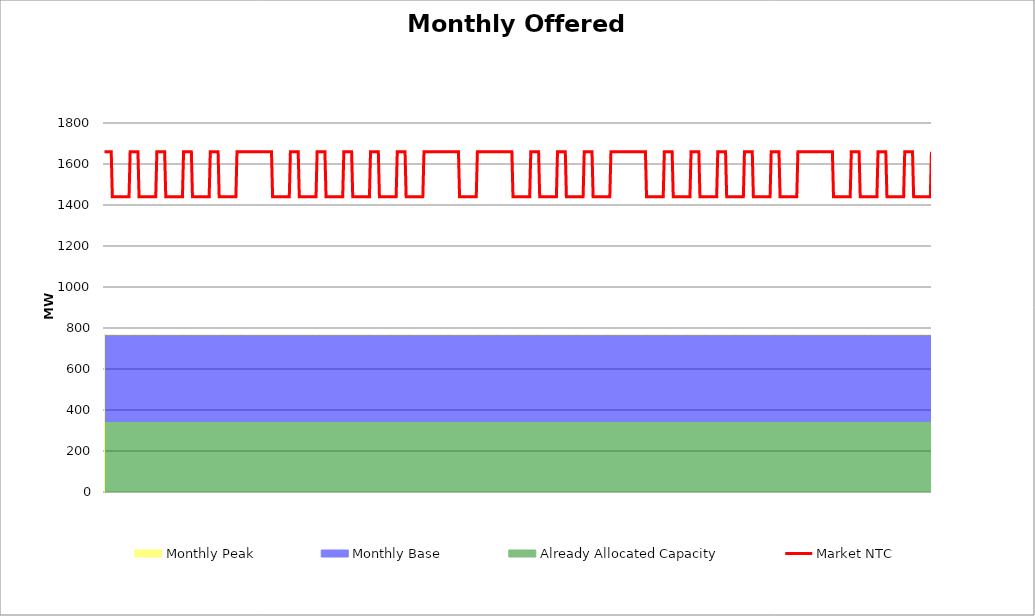
| Category | Market NTC |
|---|---|
| 0 | 1660 |
| 1 | 1660 |
| 2 | 1660 |
| 3 | 1660 |
| 4 | 1660 |
| 5 | 1660 |
| 6 | 1660 |
| 7 | 1440 |
| 8 | 1440 |
| 9 | 1440 |
| 10 | 1440 |
| 11 | 1440 |
| 12 | 1440 |
| 13 | 1440 |
| 14 | 1440 |
| 15 | 1440 |
| 16 | 1440 |
| 17 | 1440 |
| 18 | 1440 |
| 19 | 1440 |
| 20 | 1440 |
| 21 | 1440 |
| 22 | 1440 |
| 23 | 1660 |
| 24 | 1660 |
| 25 | 1660 |
| 26 | 1660 |
| 27 | 1660 |
| 28 | 1660 |
| 29 | 1660 |
| 30 | 1660 |
| 31 | 1440 |
| 32 | 1440 |
| 33 | 1440 |
| 34 | 1440 |
| 35 | 1440 |
| 36 | 1440 |
| 37 | 1440 |
| 38 | 1440 |
| 39 | 1440 |
| 40 | 1440 |
| 41 | 1440 |
| 42 | 1440 |
| 43 | 1440 |
| 44 | 1440 |
| 45 | 1440 |
| 46 | 1440 |
| 47 | 1660 |
| 48 | 1660 |
| 49 | 1660 |
| 50 | 1660 |
| 51 | 1660 |
| 52 | 1660 |
| 53 | 1660 |
| 54 | 1660 |
| 55 | 1440 |
| 56 | 1440 |
| 57 | 1440 |
| 58 | 1440 |
| 59 | 1440 |
| 60 | 1440 |
| 61 | 1440 |
| 62 | 1440 |
| 63 | 1440 |
| 64 | 1440 |
| 65 | 1440 |
| 66 | 1440 |
| 67 | 1440 |
| 68 | 1440 |
| 69 | 1440 |
| 70 | 1440 |
| 71 | 1660 |
| 72 | 1660 |
| 73 | 1660 |
| 74 | 1660 |
| 75 | 1660 |
| 76 | 1660 |
| 77 | 1660 |
| 78 | 1660 |
| 79 | 1440 |
| 80 | 1440 |
| 81 | 1440 |
| 82 | 1440 |
| 83 | 1440 |
| 84 | 1440 |
| 85 | 1440 |
| 86 | 1440 |
| 87 | 1440 |
| 88 | 1440 |
| 89 | 1440 |
| 90 | 1440 |
| 91 | 1440 |
| 92 | 1440 |
| 93 | 1440 |
| 94 | 1440 |
| 95 | 1660 |
| 96 | 1660 |
| 97 | 1660 |
| 98 | 1660 |
| 99 | 1660 |
| 100 | 1660 |
| 101 | 1660 |
| 102 | 1660 |
| 103 | 1440 |
| 104 | 1440 |
| 105 | 1440 |
| 106 | 1440 |
| 107 | 1440 |
| 108 | 1440 |
| 109 | 1440 |
| 110 | 1440 |
| 111 | 1440 |
| 112 | 1440 |
| 113 | 1440 |
| 114 | 1440 |
| 115 | 1440 |
| 116 | 1440 |
| 117 | 1440 |
| 118 | 1440 |
| 119 | 1660 |
| 120 | 1660 |
| 121 | 1660 |
| 122 | 1660 |
| 123 | 1660 |
| 124 | 1660 |
| 125 | 1660 |
| 126 | 1660 |
| 127 | 1660 |
| 128 | 1660 |
| 129 | 1660 |
| 130 | 1660 |
| 131 | 1660 |
| 132 | 1660 |
| 133 | 1660 |
| 134 | 1660 |
| 135 | 1660 |
| 136 | 1660 |
| 137 | 1660 |
| 138 | 1660 |
| 139 | 1660 |
| 140 | 1660 |
| 141 | 1660 |
| 142 | 1660 |
| 143 | 1660 |
| 144 | 1660 |
| 145 | 1660 |
| 146 | 1660 |
| 147 | 1660 |
| 148 | 1660 |
| 149 | 1660 |
| 150 | 1660 |
| 151 | 1440 |
| 152 | 1440 |
| 153 | 1440 |
| 154 | 1440 |
| 155 | 1440 |
| 156 | 1440 |
| 157 | 1440 |
| 158 | 1440 |
| 159 | 1440 |
| 160 | 1440 |
| 161 | 1440 |
| 162 | 1440 |
| 163 | 1440 |
| 164 | 1440 |
| 165 | 1440 |
| 166 | 1440 |
| 167 | 1660 |
| 168 | 1660 |
| 169 | 1660 |
| 170 | 1660 |
| 171 | 1660 |
| 172 | 1660 |
| 173 | 1660 |
| 174 | 1660 |
| 175 | 1440 |
| 176 | 1440 |
| 177 | 1440 |
| 178 | 1440 |
| 179 | 1440 |
| 180 | 1440 |
| 181 | 1440 |
| 182 | 1440 |
| 183 | 1440 |
| 184 | 1440 |
| 185 | 1440 |
| 186 | 1440 |
| 187 | 1440 |
| 188 | 1440 |
| 189 | 1440 |
| 190 | 1440 |
| 191 | 1660 |
| 192 | 1660 |
| 193 | 1660 |
| 194 | 1660 |
| 195 | 1660 |
| 196 | 1660 |
| 197 | 1660 |
| 198 | 1660 |
| 199 | 1440 |
| 200 | 1440 |
| 201 | 1440 |
| 202 | 1440 |
| 203 | 1440 |
| 204 | 1440 |
| 205 | 1440 |
| 206 | 1440 |
| 207 | 1440 |
| 208 | 1440 |
| 209 | 1440 |
| 210 | 1440 |
| 211 | 1440 |
| 212 | 1440 |
| 213 | 1440 |
| 214 | 1440 |
| 215 | 1660 |
| 216 | 1660 |
| 217 | 1660 |
| 218 | 1660 |
| 219 | 1660 |
| 220 | 1660 |
| 221 | 1660 |
| 222 | 1660 |
| 223 | 1440 |
| 224 | 1440 |
| 225 | 1440 |
| 226 | 1440 |
| 227 | 1440 |
| 228 | 1440 |
| 229 | 1440 |
| 230 | 1440 |
| 231 | 1440 |
| 232 | 1440 |
| 233 | 1440 |
| 234 | 1440 |
| 235 | 1440 |
| 236 | 1440 |
| 237 | 1440 |
| 238 | 1440 |
| 239 | 1660 |
| 240 | 1660 |
| 241 | 1660 |
| 242 | 1660 |
| 243 | 1660 |
| 244 | 1660 |
| 245 | 1660 |
| 246 | 1660 |
| 247 | 1440 |
| 248 | 1440 |
| 249 | 1440 |
| 250 | 1440 |
| 251 | 1440 |
| 252 | 1440 |
| 253 | 1440 |
| 254 | 1440 |
| 255 | 1440 |
| 256 | 1440 |
| 257 | 1440 |
| 258 | 1440 |
| 259 | 1440 |
| 260 | 1440 |
| 261 | 1440 |
| 262 | 1440 |
| 263 | 1660 |
| 264 | 1660 |
| 265 | 1660 |
| 266 | 1660 |
| 267 | 1660 |
| 268 | 1660 |
| 269 | 1660 |
| 270 | 1660 |
| 271 | 1440 |
| 272 | 1440 |
| 273 | 1440 |
| 274 | 1440 |
| 275 | 1440 |
| 276 | 1440 |
| 277 | 1440 |
| 278 | 1440 |
| 279 | 1440 |
| 280 | 1440 |
| 281 | 1440 |
| 282 | 1440 |
| 283 | 1440 |
| 284 | 1440 |
| 285 | 1440 |
| 286 | 1440 |
| 287 | 1660 |
| 288 | 1660 |
| 289 | 1660 |
| 290 | 1660 |
| 291 | 1660 |
| 292 | 1660 |
| 293 | 1660 |
| 294 | 1660 |
| 295 | 1660 |
| 296 | 1660 |
| 297 | 1660 |
| 298 | 1660 |
| 299 | 1660 |
| 300 | 1660 |
| 301 | 1660 |
| 302 | 1660 |
| 303 | 1660 |
| 304 | 1660 |
| 305 | 1660 |
| 306 | 1660 |
| 307 | 1660 |
| 308 | 1660 |
| 309 | 1660 |
| 310 | 1660 |
| 311 | 1660 |
| 312 | 1660 |
| 313 | 1660 |
| 314 | 1660 |
| 315 | 1660 |
| 316 | 1660 |
| 317 | 1660 |
| 318 | 1660 |
| 319 | 1440 |
| 320 | 1440 |
| 321 | 1440 |
| 322 | 1440 |
| 323 | 1440 |
| 324 | 1440 |
| 325 | 1440 |
| 326 | 1440 |
| 327 | 1440 |
| 328 | 1440 |
| 329 | 1440 |
| 330 | 1440 |
| 331 | 1440 |
| 332 | 1440 |
| 333 | 1440 |
| 334 | 1440 |
| 335 | 1660 |
| 336 | 1660 |
| 337 | 1660 |
| 338 | 1660 |
| 339 | 1660 |
| 340 | 1660 |
| 341 | 1660 |
| 342 | 1660 |
| 343 | 1660 |
| 344 | 1660 |
| 345 | 1660 |
| 346 | 1660 |
| 347 | 1660 |
| 348 | 1660 |
| 349 | 1660 |
| 350 | 1660 |
| 351 | 1660 |
| 352 | 1660 |
| 353 | 1660 |
| 354 | 1660 |
| 355 | 1660 |
| 356 | 1660 |
| 357 | 1660 |
| 358 | 1660 |
| 359 | 1660 |
| 360 | 1660 |
| 361 | 1660 |
| 362 | 1660 |
| 363 | 1660 |
| 364 | 1660 |
| 365 | 1660 |
| 366 | 1660 |
| 367 | 1440 |
| 368 | 1440 |
| 369 | 1440 |
| 370 | 1440 |
| 371 | 1440 |
| 372 | 1440 |
| 373 | 1440 |
| 374 | 1440 |
| 375 | 1440 |
| 376 | 1440 |
| 377 | 1440 |
| 378 | 1440 |
| 379 | 1440 |
| 380 | 1440 |
| 381 | 1440 |
| 382 | 1440 |
| 383 | 1660 |
| 384 | 1660 |
| 385 | 1660 |
| 386 | 1660 |
| 387 | 1660 |
| 388 | 1660 |
| 389 | 1660 |
| 390 | 1660 |
| 391 | 1440 |
| 392 | 1440 |
| 393 | 1440 |
| 394 | 1440 |
| 395 | 1440 |
| 396 | 1440 |
| 397 | 1440 |
| 398 | 1440 |
| 399 | 1440 |
| 400 | 1440 |
| 401 | 1440 |
| 402 | 1440 |
| 403 | 1440 |
| 404 | 1440 |
| 405 | 1440 |
| 406 | 1440 |
| 407 | 1660 |
| 408 | 1660 |
| 409 | 1660 |
| 410 | 1660 |
| 411 | 1660 |
| 412 | 1660 |
| 413 | 1660 |
| 414 | 1660 |
| 415 | 1440 |
| 416 | 1440 |
| 417 | 1440 |
| 418 | 1440 |
| 419 | 1440 |
| 420 | 1440 |
| 421 | 1440 |
| 422 | 1440 |
| 423 | 1440 |
| 424 | 1440 |
| 425 | 1440 |
| 426 | 1440 |
| 427 | 1440 |
| 428 | 1440 |
| 429 | 1440 |
| 430 | 1440 |
| 431 | 1660 |
| 432 | 1660 |
| 433 | 1660 |
| 434 | 1660 |
| 435 | 1660 |
| 436 | 1660 |
| 437 | 1660 |
| 438 | 1660 |
| 439 | 1440 |
| 440 | 1440 |
| 441 | 1440 |
| 442 | 1440 |
| 443 | 1440 |
| 444 | 1440 |
| 445 | 1440 |
| 446 | 1440 |
| 447 | 1440 |
| 448 | 1440 |
| 449 | 1440 |
| 450 | 1440 |
| 451 | 1440 |
| 452 | 1440 |
| 453 | 1440 |
| 454 | 1440 |
| 455 | 1660 |
| 456 | 1660 |
| 457 | 1660 |
| 458 | 1660 |
| 459 | 1660 |
| 460 | 1660 |
| 461 | 1660 |
| 462 | 1660 |
| 463 | 1660 |
| 464 | 1660 |
| 465 | 1660 |
| 466 | 1660 |
| 467 | 1660 |
| 468 | 1660 |
| 469 | 1660 |
| 470 | 1660 |
| 471 | 1660 |
| 472 | 1660 |
| 473 | 1660 |
| 474 | 1660 |
| 475 | 1660 |
| 476 | 1660 |
| 477 | 1660 |
| 478 | 1660 |
| 479 | 1660 |
| 480 | 1660 |
| 481 | 1660 |
| 482 | 1660 |
| 483 | 1660 |
| 484 | 1660 |
| 485 | 1660 |
| 486 | 1660 |
| 487 | 1440 |
| 488 | 1440 |
| 489 | 1440 |
| 490 | 1440 |
| 491 | 1440 |
| 492 | 1440 |
| 493 | 1440 |
| 494 | 1440 |
| 495 | 1440 |
| 496 | 1440 |
| 497 | 1440 |
| 498 | 1440 |
| 499 | 1440 |
| 500 | 1440 |
| 501 | 1440 |
| 502 | 1440 |
| 503 | 1660 |
| 504 | 1660 |
| 505 | 1660 |
| 506 | 1660 |
| 507 | 1660 |
| 508 | 1660 |
| 509 | 1660 |
| 510 | 1660 |
| 511 | 1440 |
| 512 | 1440 |
| 513 | 1440 |
| 514 | 1440 |
| 515 | 1440 |
| 516 | 1440 |
| 517 | 1440 |
| 518 | 1440 |
| 519 | 1440 |
| 520 | 1440 |
| 521 | 1440 |
| 522 | 1440 |
| 523 | 1440 |
| 524 | 1440 |
| 525 | 1440 |
| 526 | 1440 |
| 527 | 1660 |
| 528 | 1660 |
| 529 | 1660 |
| 530 | 1660 |
| 531 | 1660 |
| 532 | 1660 |
| 533 | 1660 |
| 534 | 1660 |
| 535 | 1440 |
| 536 | 1440 |
| 537 | 1440 |
| 538 | 1440 |
| 539 | 1440 |
| 540 | 1440 |
| 541 | 1440 |
| 542 | 1440 |
| 543 | 1440 |
| 544 | 1440 |
| 545 | 1440 |
| 546 | 1440 |
| 547 | 1440 |
| 548 | 1440 |
| 549 | 1440 |
| 550 | 1440 |
| 551 | 1660 |
| 552 | 1660 |
| 553 | 1660 |
| 554 | 1660 |
| 555 | 1660 |
| 556 | 1660 |
| 557 | 1660 |
| 558 | 1660 |
| 559 | 1440 |
| 560 | 1440 |
| 561 | 1440 |
| 562 | 1440 |
| 563 | 1440 |
| 564 | 1440 |
| 565 | 1440 |
| 566 | 1440 |
| 567 | 1440 |
| 568 | 1440 |
| 569 | 1440 |
| 570 | 1440 |
| 571 | 1440 |
| 572 | 1440 |
| 573 | 1440 |
| 574 | 1440 |
| 575 | 1660 |
| 576 | 1660 |
| 577 | 1660 |
| 578 | 1660 |
| 579 | 1660 |
| 580 | 1660 |
| 581 | 1660 |
| 582 | 1660 |
| 583 | 1440 |
| 584 | 1440 |
| 585 | 1440 |
| 586 | 1440 |
| 587 | 1440 |
| 588 | 1440 |
| 589 | 1440 |
| 590 | 1440 |
| 591 | 1440 |
| 592 | 1440 |
| 593 | 1440 |
| 594 | 1440 |
| 595 | 1440 |
| 596 | 1440 |
| 597 | 1440 |
| 598 | 1440 |
| 599 | 1660 |
| 600 | 1660 |
| 601 | 1660 |
| 602 | 1660 |
| 603 | 1660 |
| 604 | 1660 |
| 605 | 1660 |
| 606 | 1660 |
| 607 | 1440 |
| 608 | 1440 |
| 609 | 1440 |
| 610 | 1440 |
| 611 | 1440 |
| 612 | 1440 |
| 613 | 1440 |
| 614 | 1440 |
| 615 | 1440 |
| 616 | 1440 |
| 617 | 1440 |
| 618 | 1440 |
| 619 | 1440 |
| 620 | 1440 |
| 621 | 1440 |
| 622 | 1440 |
| 623 | 1660 |
| 624 | 1660 |
| 625 | 1660 |
| 626 | 1660 |
| 627 | 1660 |
| 628 | 1660 |
| 629 | 1660 |
| 630 | 1660 |
| 631 | 1660 |
| 632 | 1660 |
| 633 | 1660 |
| 634 | 1660 |
| 635 | 1660 |
| 636 | 1660 |
| 637 | 1660 |
| 638 | 1660 |
| 639 | 1660 |
| 640 | 1660 |
| 641 | 1660 |
| 642 | 1660 |
| 643 | 1660 |
| 644 | 1660 |
| 645 | 1660 |
| 646 | 1660 |
| 647 | 1660 |
| 648 | 1660 |
| 649 | 1660 |
| 650 | 1660 |
| 651 | 1660 |
| 652 | 1660 |
| 653 | 1660 |
| 654 | 1660 |
| 655 | 1440 |
| 656 | 1440 |
| 657 | 1440 |
| 658 | 1440 |
| 659 | 1440 |
| 660 | 1440 |
| 661 | 1440 |
| 662 | 1440 |
| 663 | 1440 |
| 664 | 1440 |
| 665 | 1440 |
| 666 | 1440 |
| 667 | 1440 |
| 668 | 1440 |
| 669 | 1440 |
| 670 | 1440 |
| 671 | 1660 |
| 672 | 1660 |
| 673 | 1660 |
| 674 | 1660 |
| 675 | 1660 |
| 676 | 1660 |
| 677 | 1660 |
| 678 | 1660 |
| 679 | 1440 |
| 680 | 1440 |
| 681 | 1440 |
| 682 | 1440 |
| 683 | 1440 |
| 684 | 1440 |
| 685 | 1440 |
| 686 | 1440 |
| 687 | 1440 |
| 688 | 1440 |
| 689 | 1440 |
| 690 | 1440 |
| 691 | 1440 |
| 692 | 1440 |
| 693 | 1440 |
| 694 | 1440 |
| 695 | 1660 |
| 696 | 1660 |
| 697 | 1660 |
| 698 | 1660 |
| 699 | 1660 |
| 700 | 1660 |
| 701 | 1660 |
| 702 | 1660 |
| 703 | 1440 |
| 704 | 1440 |
| 705 | 1440 |
| 706 | 1440 |
| 707 | 1440 |
| 708 | 1440 |
| 709 | 1440 |
| 710 | 1440 |
| 711 | 1440 |
| 712 | 1440 |
| 713 | 1440 |
| 714 | 1440 |
| 715 | 1440 |
| 716 | 1440 |
| 717 | 1440 |
| 718 | 1440 |
| 719 | 1660 |
| 720 | 1660 |
| 721 | 1660 |
| 722 | 1660 |
| 723 | 1660 |
| 724 | 1660 |
| 725 | 1660 |
| 726 | 1660 |
| 727 | 1440 |
| 728 | 1440 |
| 729 | 1440 |
| 730 | 1440 |
| 731 | 1440 |
| 732 | 1440 |
| 733 | 1440 |
| 734 | 1440 |
| 735 | 1440 |
| 736 | 1440 |
| 737 | 1440 |
| 738 | 1440 |
| 739 | 1440 |
| 740 | 1440 |
| 741 | 1440 |
| 742 | 1440 |
| 743 | 1660 |